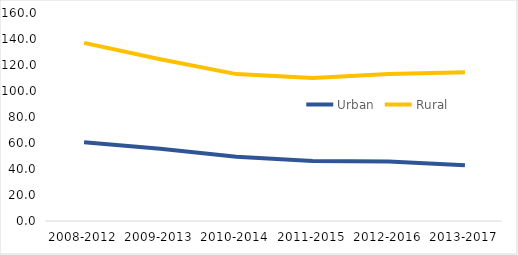
| Category | Urban | Rural |
|---|---|---|
| 2008-2012 | 60.6 | 137 |
| 2009-2013 | 55.6 | 124.4 |
| 2010-2014 | 49.4 | 113 |
| 2011-2015 | 46.2 | 110 |
| 2012-2016 | 45.8 | 113 |
| 2013-2017 | 42.8 | 114.4 |